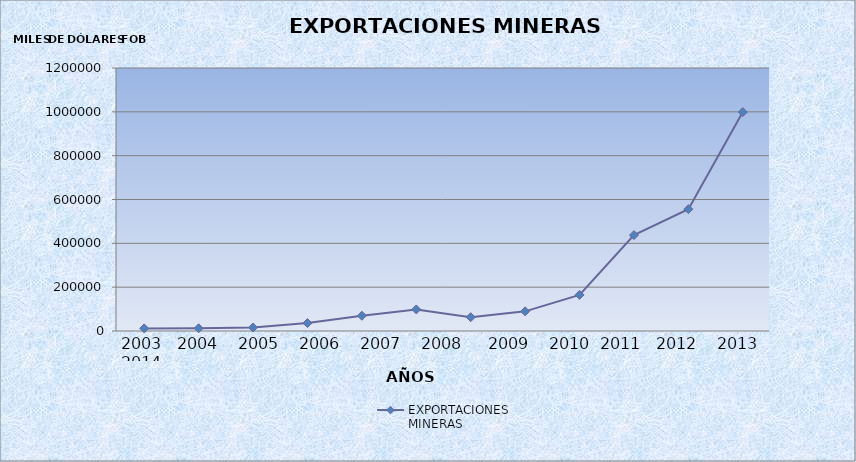
| Category | EXPORTACIONES  MINERAS |
|---|---|
| 0 | 11879 |
| 1 | 12461 |
| 2 | 15936 |
| 3 | 36036 |
| 4 | 69522.69 |
| 5 | 98282.7 |
| 6 | 62913.84 |
| 7 | 89638.75 |
| 8 | 164737 |
| 9 | 437514.19 |
| 10 | 555914.84 |
| 11 | 998802.24 |